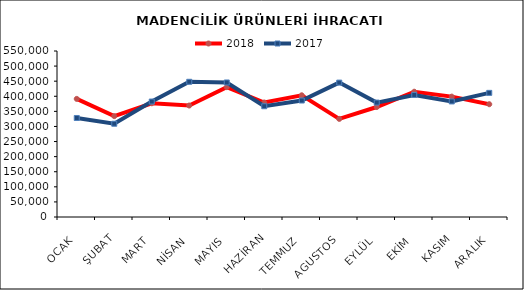
| Category | 2018 | 2017 |
|---|---|---|
| OCAK | 391324.551 | 328015.231 |
| ŞUBAT | 334207.249 | 308981.734 |
| MART | 376898.408 | 382542.66 |
| NİSAN | 369344.332 | 448004.335 |
| MAYIS | 430283.598 | 445702.488 |
| HAZİRAN | 379336.432 | 366947.62 |
| TEMMUZ | 403232.97 | 385927.325 |
| AGUSTOS | 325034.335 | 445269.329 |
| EYLÜL | 364383.165 | 379084.852 |
| EKİM | 415097.305 | 404360.623 |
| KASIM | 398860.719 | 382916.867 |
| ARALIK | 373658.935 | 411301.417 |